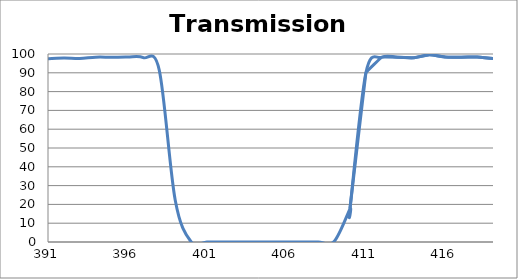
| Category | Transmission (%) |
|---|---|
| 2600.0 | 81.505 |
| 2599.0 | 81.325 |
| 2598.0 | 81.17 |
| 2597.0 | 81.029 |
| 2596.0 | 80.885 |
| 2595.0 | 80.709 |
| 2594.0 | 80.532 |
| 2593.0 | 80.373 |
| 2592.0 | 80.257 |
| 2591.0 | 80.102 |
| 2590.0 | 80.004 |
| 2589.0 | 79.88 |
| 2588.0 | 79.753 |
| 2587.0 | 79.691 |
| 2586.0 | 79.643 |
| 2585.0 | 79.518 |
| 2584.0 | 79.455 |
| 2583.0 | 79.403 |
| 2582.0 | 79.368 |
| 2581.0 | 79.414 |
| 2580.0 | 79.416 |
| 2579.0 | 79.408 |
| 2578.0 | 79.425 |
| 2577.0 | 79.477 |
| 2576.0 | 79.51 |
| 2575.0 | 79.573 |
| 2574.0 | 79.657 |
| 2573.0 | 79.706 |
| 2572.0 | 79.767 |
| 2571.0 | 79.872 |
| 2570.0 | 79.978 |
| 2569.0 | 80.113 |
| 2568.0 | 80.265 |
| 2567.0 | 80.411 |
| 2566.0 | 80.523 |
| 2565.0 | 80.657 |
| 2564.0 | 80.805 |
| 2563.0 | 80.95 |
| 2562.0 | 81.07 |
| 2561.0 | 81.199 |
| 2560.0 | 81.279 |
| 2559.0 | 81.383 |
| 2558.0 | 81.515 |
| 2557.0 | 81.59 |
| 2556.0 | 81.71 |
| 2555.0 | 81.803 |
| 2554.0 | 81.86 |
| 2553.0 | 81.938 |
| 2552.0 | 82.026 |
| 2551.0 | 82.08 |
| 2550.0 | 82.109 |
| 2549.0 | 82.13 |
| 2548.0 | 82.127 |
| 2547.0 | 82.061 |
| 2546.0 | 82.042 |
| 2545.0 | 82.046 |
| 2544.0 | 81.984 |
| 2543.0 | 81.902 |
| 2542.0 | 81.758 |
| 2541.0 | 81.629 |
| 2540.0 | 81.528 |
| 2539.0 | 81.471 |
| 2538.0 | 81.338 |
| 2537.0 | 81.219 |
| 2536.0 | 81.086 |
| 2535.0 | 80.915 |
| 2534.0 | 80.765 |
| 2533.0 | 80.627 |
| 2532.0 | 80.444 |
| 2531.0 | 80.249 |
| 2530.0 | 80.106 |
| 2529.0 | 79.963 |
| 2528.0 | 79.822 |
| 2527.0 | 79.716 |
| 2526.0 | 79.588 |
| 2525.0 | 79.464 |
| 2524.0 | 79.321 |
| 2523.0 | 79.19 |
| 2522.0 | 79.11 |
| 2521.0 | 79.058 |
| 2520.0 | 78.983 |
| 2519.0 | 78.946 |
| 2518.0 | 78.883 |
| 2517.0 | 78.867 |
| 2516.0 | 78.882 |
| 2515.0 | 78.927 |
| 2514.0 | 78.976 |
| 2513.0 | 79.034 |
| 2512.0 | 79.098 |
| 2511.0 | 79.187 |
| 2510.0 | 79.292 |
| 2509.0 | 79.455 |
| 2508.0 | 79.605 |
| 2507.0 | 79.755 |
| 2506.0 | 79.957 |
| 2505.0 | 80.179 |
| 2504.0 | 80.404 |
| 2503.0 | 80.652 |
| 2502.0 | 80.933 |
| 2501.0 | 81.179 |
| 2500.0 | 81.432 |
| 2499.0 | 81.675 |
| 2498.0 | 81.961 |
| 2497.0 | 82.24 |
| 2496.0 | 82.509 |
| 2495.0 | 82.776 |
| 2494.0 | 83.036 |
| 2493.0 | 83.261 |
| 2492.0 | 83.491 |
| 2491.0 | 83.715 |
| 2490.0 | 83.932 |
| 2489.0 | 84.124 |
| 2488.0 | 84.285 |
| 2487.0 | 84.411 |
| 2486.0 | 84.506 |
| 2485.0 | 84.6 |
| 2484.0 | 84.663 |
| 2483.0 | 84.667 |
| 2482.0 | 84.665 |
| 2481.0 | 84.608 |
| 2480.0 | 84.511 |
| 2479.0 | 84.399 |
| 2478.0 | 84.261 |
| 2477.0 | 84.068 |
| 2476.0 | 83.877 |
| 2475.0 | 83.631 |
| 2474.0 | 83.328 |
| 2473.0 | 83.002 |
| 2472.0 | 82.655 |
| 2471.0 | 82.271 |
| 2470.0 | 81.857 |
| 2469.0 | 81.446 |
| 2468.0 | 81.026 |
| 2467.0 | 80.596 |
| 2466.0 | 80.125 |
| 2465.0 | 79.645 |
| 2464.0 | 79.175 |
| 2463.0 | 78.736 |
| 2462.0 | 78.271 |
| 2461.0 | 77.819 |
| 2460.0 | 77.394 |
| 2459.0 | 76.996 |
| 2458.0 | 76.594 |
| 2457.0 | 76.221 |
| 2456.0 | 75.868 |
| 2455.0 | 75.517 |
| 2454.0 | 75.199 |
| 2453.0 | 74.909 |
| 2452.0 | 74.654 |
| 2451.0 | 74.422 |
| 2450.0 | 74.24 |
| 2449.0 | 74.1 |
| 2448.0 | 73.976 |
| 2447.0 | 73.879 |
| 2446.0 | 73.823 |
| 2445.0 | 73.828 |
| 2444.0 | 73.857 |
| 2443.0 | 73.939 |
| 2442.0 | 74.049 |
| 2441.0 | 74.206 |
| 2440.0 | 74.399 |
| 2439.0 | 74.628 |
| 2438.0 | 74.918 |
| 2437.0 | 75.265 |
| 2436.0 | 75.65 |
| 2435.0 | 76.057 |
| 2434.0 | 76.501 |
| 2433.0 | 76.994 |
| 2432.0 | 77.513 |
| 2431.0 | 78.064 |
| 2430.0 | 78.665 |
| 2429.0 | 79.292 |
| 2428.0 | 79.911 |
| 2427.0 | 80.556 |
| 2426.0 | 81.233 |
| 2425.0 | 81.949 |
| 2424.0 | 82.669 |
| 2423.0 | 83.368 |
| 2422.0 | 84.075 |
| 2421.0 | 84.778 |
| 2420.0 | 85.47 |
| 2419.0 | 86.127 |
| 2418.0 | 86.767 |
| 2417.0 | 87.406 |
| 2416.0 | 87.996 |
| 2415.0 | 88.53 |
| 2414.0 | 89.01 |
| 2413.0 | 89.428 |
| 2412.0 | 89.811 |
| 2411.0 | 90.143 |
| 2410.0 | 90.417 |
| 2409.0 | 90.65 |
| 2408.0 | 90.827 |
| 2407.0 | 90.922 |
| 2406.0 | 90.951 |
| 2405.0 | 90.899 |
| 2404.0 | 90.793 |
| 2403.0 | 90.626 |
| 2402.0 | 90.402 |
| 2401.0 | 90.124 |
| 2400.0 | 89.799 |
| 2399.0 | 89.415 |
| 2398.0 | 88.984 |
| 2397.0 | 88.524 |
| 2396.0 | 88.029 |
| 2395.0 | 87.504 |
| 2394.0 | 86.965 |
| 2393.0 | 86.405 |
| 2392.0 | 85.833 |
| 2391.0 | 85.267 |
| 2390.0 | 84.705 |
| 2389.0 | 84.138 |
| 2388.0 | 83.595 |
| 2387.0 | 83.078 |
| 2386.0 | 82.586 |
| 2385.0 | 82.103 |
| 2384.0 | 81.663 |
| 2383.0 | 81.265 |
| 2382.0 | 80.892 |
| 2381.0 | 80.572 |
| 2380.0 | 80.294 |
| 2379.0 | 80.064 |
| 2378.0 | 79.902 |
| 2377.0 | 79.772 |
| 2376.0 | 79.693 |
| 2375.0 | 79.665 |
| 2374.0 | 79.679 |
| 2373.0 | 79.739 |
| 2372.0 | 79.866 |
| 2371.0 | 80.029 |
| 2370.0 | 80.21 |
| 2369.0 | 80.454 |
| 2368.0 | 80.756 |
| 2367.0 | 81.091 |
| 2366.0 | 81.476 |
| 2365.0 | 81.931 |
| 2364.0 | 82.432 |
| 2363.0 | 82.922 |
| 2362.0 | 83.446 |
| 2361.0 | 84.02 |
| 2360.0 | 84.632 |
| 2359.0 | 85.286 |
| 2358.0 | 85.937 |
| 2357.0 | 86.585 |
| 2356.0 | 87.237 |
| 2355.0 | 87.923 |
| 2354.0 | 88.568 |
| 2353.0 | 89.222 |
| 2352.0 | 89.856 |
| 2351.0 | 90.472 |
| 2350.0 | 91.02 |
| 2349.0 | 91.53 |
| 2348.0 | 91.994 |
| 2347.0 | 92.431 |
| 2346.0 | 92.778 |
| 2345.0 | 93.046 |
| 2344.0 | 93.255 |
| 2343.0 | 93.433 |
| 2342.0 | 93.522 |
| 2341.0 | 93.52 |
| 2340.0 | 93.434 |
| 2339.0 | 93.32 |
| 2338.0 | 93.139 |
| 2337.0 | 92.886 |
| 2336.0 | 92.553 |
| 2335.0 | 92.158 |
| 2334.0 | 91.75 |
| 2333.0 | 91.283 |
| 2332.0 | 90.784 |
| 2331.0 | 90.245 |
| 2330.0 | 89.708 |
| 2329.0 | 89.118 |
| 2328.0 | 88.506 |
| 2327.0 | 87.868 |
| 2326.0 | 87.291 |
| 2325.0 | 86.664 |
| 2324.0 | 86.088 |
| 2323.0 | 85.506 |
| 2322.0 | 84.932 |
| 2321.0 | 84.404 |
| 2320.0 | 83.891 |
| 2319.0 | 83.404 |
| 2318.0 | 82.998 |
| 2317.0 | 82.629 |
| 2316.0 | 82.276 |
| 2315.0 | 81.95 |
| 2314.0 | 81.702 |
| 2313.0 | 81.476 |
| 2312.0 | 81.338 |
| 2311.0 | 81.286 |
| 2310.0 | 81.269 |
| 2309.0 | 81.293 |
| 2308.0 | 81.341 |
| 2307.0 | 81.485 |
| 2306.0 | 81.677 |
| 2305.0 | 81.931 |
| 2304.0 | 82.213 |
| 2303.0 | 82.566 |
| 2302.0 | 82.92 |
| 2301.0 | 83.36 |
| 2300.0 | 83.825 |
| 2299.0 | 84.349 |
| 2298.0 | 84.864 |
| 2297.0 | 85.427 |
| 2296.0 | 86.002 |
| 2295.0 | 86.581 |
| 2294.0 | 87.191 |
| 2293.0 | 87.789 |
| 2292.0 | 88.376 |
| 2291.0 | 88.966 |
| 2290.0 | 89.537 |
| 2289.0 | 90.091 |
| 2288.0 | 90.642 |
| 2287.0 | 91.156 |
| 2286.0 | 91.634 |
| 2285.0 | 92.08 |
| 2284.0 | 92.471 |
| 2283.0 | 92.81 |
| 2282.0 | 93.115 |
| 2281.0 | 93.344 |
| 2280.0 | 93.5 |
| 2279.0 | 93.62 |
| 2278.0 | 93.677 |
| 2277.0 | 93.631 |
| 2276.0 | 93.508 |
| 2275.0 | 93.35 |
| 2274.0 | 93.147 |
| 2273.0 | 92.903 |
| 2272.0 | 92.579 |
| 2271.0 | 92.209 |
| 2270.0 | 91.84 |
| 2269.0 | 91.4 |
| 2268.0 | 90.937 |
| 2267.0 | 90.468 |
| 2266.0 | 90.032 |
| 2265.0 | 89.496 |
| 2264.0 | 89.024 |
| 2263.0 | 88.556 |
| 2262.0 | 88.095 |
| 2261.0 | 87.675 |
| 2260.0 | 87.276 |
| 2259.0 | 86.876 |
| 2258.0 | 86.531 |
| 2257.0 | 86.218 |
| 2256.0 | 85.915 |
| 2255.0 | 85.703 |
| 2254.0 | 85.489 |
| 2253.0 | 85.335 |
| 2252.0 | 85.246 |
| 2251.0 | 85.195 |
| 2250.0 | 85.169 |
| 2249.0 | 85.183 |
| 2248.0 | 85.266 |
| 2247.0 | 85.405 |
| 2246.0 | 85.595 |
| 2245.0 | 85.775 |
| 2244.0 | 85.998 |
| 2243.0 | 86.243 |
| 2242.0 | 86.615 |
| 2241.0 | 86.948 |
| 2240.0 | 87.346 |
| 2239.0 | 87.733 |
| 2238.0 | 88.147 |
| 2237.0 | 88.592 |
| 2236.0 | 89.016 |
| 2235.0 | 89.464 |
| 2234.0 | 89.933 |
| 2233.0 | 90.358 |
| 2232.0 | 90.762 |
| 2231.0 | 91.135 |
| 2230.0 | 91.485 |
| 2229.0 | 91.822 |
| 2228.0 | 92.101 |
| 2227.0 | 92.36 |
| 2226.0 | 92.547 |
| 2225.0 | 92.667 |
| 2224.0 | 92.784 |
| 2223.0 | 92.824 |
| 2222.0 | 92.825 |
| 2221.0 | 92.78 |
| 2220.0 | 92.629 |
| 2219.0 | 92.437 |
| 2218.0 | 92.26 |
| 2217.0 | 91.982 |
| 2216.0 | 91.714 |
| 2215.0 | 91.404 |
| 2214.0 | 91.047 |
| 2213.0 | 90.668 |
| 2212.0 | 90.323 |
| 2211.0 | 89.85 |
| 2210.0 | 89.45 |
| 2209.0 | 89.045 |
| 2208.0 | 88.653 |
| 2207.0 | 88.267 |
| 2206.0 | 87.926 |
| 2205.0 | 87.549 |
| 2204.0 | 87.228 |
| 2203.0 | 86.936 |
| 2202.0 | 86.673 |
| 2201.0 | 86.442 |
| 2200.0 | 86.254 |
| 2199.0 | 86.066 |
| 2198.0 | 85.96 |
| 2197.0 | 85.886 |
| 2196.0 | 85.871 |
| 2195.0 | 85.873 |
| 2194.0 | 85.923 |
| 2193.0 | 86.076 |
| 2192.0 | 86.207 |
| 2191.0 | 86.397 |
| 2190.0 | 86.634 |
| 2189.0 | 86.908 |
| 2188.0 | 87.21 |
| 2187.0 | 87.525 |
| 2186.0 | 87.913 |
| 2185.0 | 88.317 |
| 2184.0 | 88.72 |
| 2183.0 | 89.176 |
| 2182.0 | 89.619 |
| 2181.0 | 90.054 |
| 2180.0 | 90.512 |
| 2179.0 | 90.931 |
| 2178.0 | 91.335 |
| 2177.0 | 91.761 |
| 2176.0 | 92.131 |
| 2175.0 | 92.507 |
| 2174.0 | 92.831 |
| 2173.0 | 93.097 |
| 2172.0 | 93.356 |
| 2171.0 | 93.554 |
| 2170.0 | 93.707 |
| 2169.0 | 93.842 |
| 2168.0 | 93.918 |
| 2167.0 | 93.982 |
| 2166.0 | 93.955 |
| 2165.0 | 93.922 |
| 2164.0 | 93.813 |
| 2163.0 | 93.669 |
| 2162.0 | 93.48 |
| 2161.0 | 93.247 |
| 2160.0 | 93.051 |
| 2159.0 | 92.78 |
| 2158.0 | 92.527 |
| 2157.0 | 92.229 |
| 2156.0 | 91.919 |
| 2155.0 | 91.62 |
| 2154.0 | 91.31 |
| 2153.0 | 91.038 |
| 2152.0 | 90.786 |
| 2151.0 | 90.55 |
| 2150.0 | 90.323 |
| 2149.0 | 90.13 |
| 2148.0 | 89.964 |
| 2147.0 | 89.812 |
| 2146.0 | 89.735 |
| 2145.0 | 89.673 |
| 2144.0 | 89.657 |
| 2143.0 | 89.671 |
| 2142.0 | 89.72 |
| 2141.0 | 89.806 |
| 2140.0 | 89.933 |
| 2139.0 | 90.066 |
| 2138.0 | 90.257 |
| 2137.0 | 90.47 |
| 2136.0 | 90.693 |
| 2135.0 | 90.958 |
| 2134.0 | 91.221 |
| 2133.0 | 91.495 |
| 2132.0 | 91.777 |
| 2131.0 | 92.078 |
| 2130.0 | 92.375 |
| 2129.0 | 92.673 |
| 2128.0 | 92.894 |
| 2127.0 | 93.145 |
| 2126.0 | 93.387 |
| 2125.0 | 93.62 |
| 2124.0 | 93.807 |
| 2123.0 | 93.931 |
| 2122.0 | 94.027 |
| 2121.0 | 94.088 |
| 2120.0 | 94.12 |
| 2119.0 | 94.115 |
| 2118.0 | 94.046 |
| 2117.0 | 93.924 |
| 2116.0 | 93.768 |
| 2115.0 | 93.599 |
| 2114.0 | 93.392 |
| 2113.0 | 93.168 |
| 2112.0 | 92.896 |
| 2111.0 | 92.582 |
| 2110.0 | 92.283 |
| 2109.0 | 91.966 |
| 2108.0 | 91.624 |
| 2107.0 | 91.301 |
| 2106.0 | 91.007 |
| 2105.0 | 90.713 |
| 2104.0 | 90.436 |
| 2103.0 | 90.165 |
| 2102.0 | 89.909 |
| 2101.0 | 89.713 |
| 2100.0 | 89.541 |
| 2099.0 | 89.406 |
| 2098.0 | 89.297 |
| 2097.0 | 89.21 |
| 2096.0 | 89.199 |
| 2095.0 | 89.224 |
| 2094.0 | 89.289 |
| 2093.0 | 89.397 |
| 2092.0 | 89.531 |
| 2091.0 | 89.672 |
| 2090.0 | 89.82 |
| 2089.0 | 89.996 |
| 2088.0 | 90.218 |
| 2087.0 | 90.509 |
| 2086.0 | 90.782 |
| 2085.0 | 91.065 |
| 2084.0 | 91.31 |
| 2083.0 | 91.564 |
| 2082.0 | 91.793 |
| 2081.0 | 92.022 |
| 2080.0 | 92.269 |
| 2079.0 | 92.462 |
| 2078.0 | 92.597 |
| 2077.0 | 92.691 |
| 2076.0 | 92.731 |
| 2075.0 | 92.71 |
| 2074.0 | 92.637 |
| 2073.0 | 92.522 |
| 2072.0 | 92.366 |
| 2071.0 | 92.118 |
| 2070.0 | 91.825 |
| 2069.0 | 91.478 |
| 2068.0 | 91.078 |
| 2067.0 | 90.654 |
| 2066.0 | 90.193 |
| 2065.0 | 89.69 |
| 2064.0 | 89.182 |
| 2063.0 | 88.652 |
| 2062.0 | 88.115 |
| 2061.0 | 87.611 |
| 2060.0 | 87.128 |
| 2059.0 | 86.646 |
| 2058.0 | 86.181 |
| 2057.0 | 85.746 |
| 2056.0 | 85.338 |
| 2055.0 | 84.996 |
| 2054.0 | 84.741 |
| 2053.0 | 84.511 |
| 2052.0 | 84.299 |
| 2051.0 | 84.145 |
| 2050.0 | 84.072 |
| 2049.0 | 84.042 |
| 2048.0 | 84.071 |
| 2047.0 | 84.171 |
| 2046.0 | 84.346 |
| 2045.0 | 84.565 |
| 2044.0 | 84.823 |
| 2043.0 | 85.153 |
| 2042.0 | 85.554 |
| 2041.0 | 86.015 |
| 2040.0 | 86.502 |
| 2039.0 | 86.973 |
| 2038.0 | 87.482 |
| 2037.0 | 88.023 |
| 2036.0 | 88.598 |
| 2035.0 | 89.177 |
| 2034.0 | 89.708 |
| 2033.0 | 90.196 |
| 2032.0 | 90.659 |
| 2031.0 | 91.089 |
| 2030.0 | 91.445 |
| 2029.0 | 91.746 |
| 2028.0 | 91.975 |
| 2027.0 | 92.117 |
| 2026.0 | 92.162 |
| 2025.0 | 92.107 |
| 2024.0 | 91.984 |
| 2023.0 | 91.776 |
| 2022.0 | 91.469 |
| 2021.0 | 91.082 |
| 2020.0 | 90.583 |
| 2019.0 | 90.011 |
| 2018.0 | 89.407 |
| 2017.0 | 88.752 |
| 2016.0 | 88.108 |
| 2015.0 | 87.445 |
| 2014.0 | 86.761 |
| 2013.0 | 86.085 |
| 2012.0 | 85.383 |
| 2011.0 | 84.731 |
| 2010.0 | 84.12 |
| 2009.0 | 83.534 |
| 2008.0 | 82.977 |
| 2007.0 | 82.463 |
| 2006.0 | 82.01 |
| 2005.0 | 81.628 |
| 2004.0 | 81.321 |
| 2003.0 | 81.071 |
| 2002.0 | 80.902 |
| 2001.0 | 80.811 |
| 2000.0 | 80.783 |
| 1999.0 | 80.832 |
| 1998.0 | 80.968 |
| 1997.0 | 81.2 |
| 1996.0 | 81.491 |
| 1995.0 | 81.842 |
| 1994.0 | 82.261 |
| 1993.0 | 82.78 |
| 1992.0 | 83.34 |
| 1991.0 | 83.91 |
| 1990.0 | 84.527 |
| 1989.0 | 85.172 |
| 1988.0 | 85.806 |
| 1987.0 | 86.436 |
| 1986.0 | 87.053 |
| 1985.0 | 87.657 |
| 1984.0 | 88.236 |
| 1983.0 | 88.751 |
| 1982.0 | 89.198 |
| 1981.0 | 89.582 |
| 1980.0 | 89.881 |
| 1979.0 | 90.078 |
| 1978.0 | 90.212 |
| 1977.0 | 90.269 |
| 1976.0 | 90.254 |
| 1975.0 | 90.134 |
| 1974.0 | 89.926 |
| 1973.0 | 89.647 |
| 1972.0 | 89.301 |
| 1971.0 | 88.906 |
| 1970.0 | 88.434 |
| 1969.0 | 87.938 |
| 1968.0 | 87.451 |
| 1967.0 | 86.967 |
| 1966.0 | 86.441 |
| 1965.0 | 85.919 |
| 1964.0 | 85.417 |
| 1963.0 | 84.992 |
| 1962.0 | 84.55 |
| 1961.0 | 84.181 |
| 1960.0 | 83.904 |
| 1959.0 | 83.68 |
| 1958.0 | 83.479 |
| 1957.0 | 83.374 |
| 1956.0 | 83.357 |
| 1955.0 | 83.404 |
| 1954.0 | 83.526 |
| 1953.0 | 83.758 |
| 1952.0 | 84.025 |
| 1951.0 | 84.372 |
| 1950.0 | 84.778 |
| 1949.0 | 85.29 |
| 1948.0 | 85.779 |
| 1947.0 | 86.368 |
| 1946.0 | 86.995 |
| 1945.0 | 87.593 |
| 1944.0 | 88.262 |
| 1943.0 | 88.885 |
| 1942.0 | 89.445 |
| 1941.0 | 90.051 |
| 1940.0 | 90.615 |
| 1939.0 | 91.135 |
| 1938.0 | 91.515 |
| 1937.0 | 91.824 |
| 1936.0 | 92.082 |
| 1935.0 | 92.285 |
| 1934.0 | 92.384 |
| 1933.0 | 92.388 |
| 1932.0 | 92.29 |
| 1931.0 | 92.096 |
| 1930.0 | 91.86 |
| 1929.0 | 91.542 |
| 1928.0 | 91.113 |
| 1927.0 | 90.635 |
| 1926.0 | 90.115 |
| 1925.0 | 89.559 |
| 1924.0 | 89.024 |
| 1923.0 | 88.507 |
| 1922.0 | 87.985 |
| 1921.0 | 87.402 |
| 1920.0 | 86.801 |
| 1919.0 | 86.281 |
| 1918.0 | 85.857 |
| 1917.0 | 85.467 |
| 1916.0 | 85.239 |
| 1915.0 | 85.085 |
| 1914.0 | 84.956 |
| 1913.0 | 84.851 |
| 1912.0 | 84.801 |
| 1911.0 | 84.857 |
| 1910.0 | 84.981 |
| 1909.0 | 85.197 |
| 1908.0 | 85.51 |
| 1907.0 | 85.846 |
| 1906.0 | 86.362 |
| 1905.0 | 86.854 |
| 1904.0 | 87.409 |
| 1903.0 | 87.961 |
| 1902.0 | 88.543 |
| 1901.0 | 89.161 |
| 1900.0 | 89.839 |
| 1899.0 | 90.473 |
| 1898.0 | 91.148 |
| 1897.0 | 91.701 |
| 1896.0 | 92.193 |
| 1895.0 | 92.663 |
| 1894.0 | 93.124 |
| 1893.0 | 93.532 |
| 1892.0 | 93.876 |
| 1891.0 | 94.156 |
| 1890.0 | 94.328 |
| 1889.0 | 94.433 |
| 1888.0 | 94.519 |
| 1887.0 | 94.535 |
| 1886.0 | 94.472 |
| 1885.0 | 94.388 |
| 1884.0 | 94.213 |
| 1883.0 | 93.964 |
| 1882.0 | 93.768 |
| 1881.0 | 93.538 |
| 1880.0 | 93.245 |
| 1879.0 | 93.034 |
| 1878.0 | 92.809 |
| 1877.0 | 92.557 |
| 1876.0 | 92.334 |
| 1875.0 | 92.173 |
| 1874.0 | 91.978 |
| 1873.0 | 91.878 |
| 1872.0 | 91.741 |
| 1871.0 | 91.657 |
| 1870.0 | 91.628 |
| 1869.0 | 91.721 |
| 1868.0 | 91.719 |
| 1867.0 | 91.835 |
| 1866.0 | 91.926 |
| 1865.0 | 92.06 |
| 1864.0 | 92.22 |
| 1863.0 | 92.407 |
| 1862.0 | 92.635 |
| 1861.0 | 92.782 |
| 1860.0 | 92.924 |
| 1859.0 | 93.09 |
| 1858.0 | 93.209 |
| 1857.0 | 93.351 |
| 1856.0 | 93.439 |
| 1855.0 | 93.469 |
| 1854.0 | 93.54 |
| 1853.0 | 93.569 |
| 1852.0 | 93.596 |
| 1851.0 | 93.592 |
| 1850.0 | 93.614 |
| 1849.0 | 93.581 |
| 1848.0 | 93.616 |
| 1847.0 | 93.51 |
| 1846.0 | 93.425 |
| 1845.0 | 93.42 |
| 1844.0 | 93.274 |
| 1843.0 | 93.289 |
| 1842.0 | 93.339 |
| 1841.0 | 93.259 |
| 1840.0 | 93.305 |
| 1839.0 | 93.35 |
| 1838.0 | 93.29 |
| 1837.0 | 93.367 |
| 1836.0 | 93.456 |
| 1835.0 | 93.534 |
| 1834.0 | 93.605 |
| 1833.0 | 93.662 |
| 1832.0 | 93.757 |
| 1831.0 | 93.806 |
| 1830.0 | 93.851 |
| 1829.0 | 93.818 |
| 1828.0 | 93.796 |
| 1827.0 | 93.708 |
| 1826.0 | 93.586 |
| 1825.0 | 93.35 |
| 1824.0 | 93.041 |
| 1823.0 | 92.855 |
| 1822.0 | 92.636 |
| 1821.0 | 92.256 |
| 1820.0 | 91.802 |
| 1819.0 | 91.208 |
| 1818.0 | 90.741 |
| 1817.0 | 90.236 |
| 1816.0 | 89.799 |
| 1815.0 | 89.3 |
| 1814.0 | 88.769 |
| 1813.0 | 88.298 |
| 1812.0 | 87.837 |
| 1811.0 | 87.437 |
| 1810.0 | 87.051 |
| 1809.0 | 86.741 |
| 1808.0 | 86.522 |
| 1807.0 | 86.348 |
| 1806.0 | 86.2 |
| 1805.0 | 86.202 |
| 1804.0 | 86.275 |
| 1803.0 | 86.407 |
| 1802.0 | 86.598 |
| 1801.0 | 86.866 |
| 1800.0 | 87.245 |
| 1799.0 | 87.662 |
| 1798.0 | 88.139 |
| 1797.0 | 88.63 |
| 1796.0 | 89.092 |
| 1795.0 | 89.577 |
| 1794.0 | 90.019 |
| 1793.0 | 90.448 |
| 1792.0 | 90.791 |
| 1791.0 | 91.057 |
| 1790.0 | 91.209 |
| 1789.0 | 91.268 |
| 1788.0 | 91.171 |
| 1787.0 | 90.912 |
| 1786.0 | 90.515 |
| 1785.0 | 89.964 |
| 1784.0 | 89.316 |
| 1783.0 | 88.544 |
| 1782.0 | 87.661 |
| 1781.0 | 86.766 |
| 1780.0 | 85.75 |
| 1779.0 | 84.66 |
| 1778.0 | 83.572 |
| 1777.0 | 82.538 |
| 1776.0 | 81.513 |
| 1775.0 | 80.606 |
| 1774.0 | 79.73 |
| 1773.0 | 78.948 |
| 1772.0 | 78.243 |
| 1771.0 | 77.657 |
| 1770.0 | 77.147 |
| 1769.0 | 76.775 |
| 1768.0 | 76.53 |
| 1767.0 | 76.388 |
| 1766.0 | 76.367 |
| 1765.0 | 76.512 |
| 1764.0 | 76.772 |
| 1763.0 | 77.142 |
| 1762.0 | 77.62 |
| 1761.0 | 78.216 |
| 1760.0 | 78.901 |
| 1759.0 | 79.647 |
| 1758.0 | 80.469 |
| 1757.0 | 81.303 |
| 1756.0 | 82.153 |
| 1755.0 | 82.988 |
| 1754.0 | 83.75 |
| 1753.0 | 84.467 |
| 1752.0 | 85.085 |
| 1751.0 | 85.523 |
| 1750.0 | 85.843 |
| 1749.0 | 86.014 |
| 1748.0 | 86.022 |
| 1747.0 | 85.879 |
| 1746.0 | 85.583 |
| 1745.0 | 85.155 |
| 1744.0 | 84.572 |
| 1743.0 | 83.941 |
| 1742.0 | 83.217 |
| 1741.0 | 82.468 |
| 1740.0 | 81.699 |
| 1739.0 | 80.974 |
| 1738.0 | 80.239 |
| 1737.0 | 79.58 |
| 1736.0 | 79.008 |
| 1735.0 | 78.523 |
| 1734.0 | 78.098 |
| 1733.0 | 77.807 |
| 1732.0 | 77.601 |
| 1731.0 | 77.486 |
| 1730.0 | 77.528 |
| 1729.0 | 77.669 |
| 1728.0 | 77.929 |
| 1727.0 | 78.273 |
| 1726.0 | 78.693 |
| 1725.0 | 79.165 |
| 1724.0 | 79.71 |
| 1723.0 | 80.335 |
| 1722.0 | 80.958 |
| 1721.0 | 81.585 |
| 1720.0 | 82.178 |
| 1719.0 | 82.659 |
| 1718.0 | 83.07 |
| 1717.0 | 83.414 |
| 1716.0 | 83.63 |
| 1715.0 | 83.724 |
| 1714.0 | 83.682 |
| 1713.0 | 83.459 |
| 1712.0 | 83.115 |
| 1711.0 | 82.67 |
| 1710.0 | 82.12 |
| 1709.0 | 81.507 |
| 1708.0 | 80.845 |
| 1707.0 | 80.175 |
| 1706.0 | 79.494 |
| 1705.0 | 78.818 |
| 1704.0 | 78.181 |
| 1703.0 | 77.62 |
| 1702.0 | 77.126 |
| 1701.0 | 76.755 |
| 1700.0 | 76.463 |
| 1699.0 | 76.265 |
| 1698.0 | 76.158 |
| 1697.0 | 76.163 |
| 1696.0 | 76.258 |
| 1695.0 | 76.472 |
| 1694.0 | 76.742 |
| 1693.0 | 77.035 |
| 1692.0 | 77.385 |
| 1691.0 | 77.746 |
| 1690.0 | 78.118 |
| 1689.0 | 78.471 |
| 1688.0 | 78.798 |
| 1687.0 | 79.058 |
| 1686.0 | 79.214 |
| 1685.0 | 79.257 |
| 1684.0 | 79.212 |
| 1683.0 | 79.056 |
| 1682.0 | 78.768 |
| 1681.0 | 78.354 |
| 1680.0 | 77.829 |
| 1679.0 | 77.202 |
| 1678.0 | 76.515 |
| 1677.0 | 75.799 |
| 1676.0 | 75.061 |
| 1675.0 | 74.33 |
| 1674.0 | 73.626 |
| 1673.0 | 73.009 |
| 1672.0 | 72.484 |
| 1671.0 | 72.026 |
| 1670.0 | 71.68 |
| 1669.0 | 71.453 |
| 1668.0 | 71.355 |
| 1667.0 | 71.393 |
| 1666.0 | 71.542 |
| 1665.0 | 71.818 |
| 1664.0 | 72.216 |
| 1663.0 | 72.696 |
| 1662.0 | 73.242 |
| 1661.0 | 73.841 |
| 1660.0 | 74.427 |
| 1659.0 | 74.999 |
| 1658.0 | 75.543 |
| 1657.0 | 75.973 |
| 1656.0 | 76.305 |
| 1655.0 | 76.519 |
| 1654.0 | 76.555 |
| 1653.0 | 76.414 |
| 1652.0 | 76.089 |
| 1651.0 | 75.575 |
| 1650.0 | 74.906 |
| 1649.0 | 74.108 |
| 1648.0 | 73.207 |
| 1647.0 | 72.169 |
| 1646.0 | 71.081 |
| 1645.0 | 70.002 |
| 1644.0 | 68.895 |
| 1643.0 | 67.853 |
| 1642.0 | 66.872 |
| 1641.0 | 65.984 |
| 1640.0 | 65.218 |
| 1639.0 | 64.597 |
| 1638.0 | 64.148 |
| 1637.0 | 63.861 |
| 1636.0 | 63.756 |
| 1635.0 | 63.816 |
| 1634.0 | 64.034 |
| 1633.0 | 64.441 |
| 1632.0 | 64.968 |
| 1631.0 | 65.612 |
| 1630.0 | 66.378 |
| 1629.0 | 67.207 |
| 1628.0 | 68.089 |
| 1627.0 | 68.99 |
| 1626.0 | 69.854 |
| 1625.0 | 70.661 |
| 1624.0 | 71.367 |
| 1623.0 | 71.919 |
| 1622.0 | 72.294 |
| 1621.0 | 72.486 |
| 1620.0 | 72.508 |
| 1619.0 | 72.334 |
| 1618.0 | 71.994 |
| 1617.0 | 71.524 |
| 1616.0 | 70.955 |
| 1615.0 | 70.325 |
| 1614.0 | 69.647 |
| 1613.0 | 68.967 |
| 1612.0 | 68.334 |
| 1611.0 | 67.769 |
| 1610.0 | 67.306 |
| 1609.0 | 66.964 |
| 1608.0 | 66.772 |
| 1607.0 | 66.742 |
| 1606.0 | 66.862 |
| 1605.0 | 67.152 |
| 1604.0 | 67.587 |
| 1603.0 | 68.183 |
| 1602.0 | 68.933 |
| 1601.0 | 69.785 |
| 1600.0 | 70.723 |
| 1599.0 | 71.707 |
| 1598.0 | 72.671 |
| 1597.0 | 73.563 |
| 1596.0 | 74.327 |
| 1595.0 | 74.878 |
| 1594.0 | 75.185 |
| 1593.0 | 75.231 |
| 1592.0 | 74.972 |
| 1591.0 | 74.433 |
| 1590.0 | 73.625 |
| 1589.0 | 72.576 |
| 1588.0 | 71.35 |
| 1587.0 | 69.993 |
| 1586.0 | 68.56 |
| 1585.0 | 67.162 |
| 1584.0 | 65.832 |
| 1583.0 | 64.62 |
| 1582.0 | 63.545 |
| 1581.0 | 62.614 |
| 1580.0 | 61.905 |
| 1579.0 | 61.414 |
| 1578.0 | 61.121 |
| 1577.0 | 61.05 |
| 1576.0 | 61.213 |
| 1575.0 | 61.603 |
| 1574.0 | 62.197 |
| 1573.0 | 63.019 |
| 1572.0 | 63.995 |
| 1571.0 | 65.102 |
| 1570.0 | 66.351 |
| 1569.0 | 67.66 |
| 1568.0 | 68.958 |
| 1567.0 | 70.217 |
| 1566.0 | 71.358 |
| 1565.0 | 72.392 |
| 1564.0 | 73.187 |
| 1563.0 | 73.661 |
| 1562.0 | 73.808 |
| 1561.0 | 73.623 |
| 1560.0 | 73.169 |
| 1559.0 | 72.419 |
| 1558.0 | 71.486 |
| 1557.0 | 70.355 |
| 1556.0 | 69.177 |
| 1555.0 | 68.003 |
| 1554.0 | 66.89 |
| 1553.0 | 65.866 |
| 1552.0 | 64.982 |
| 1551.0 | 64.341 |
| 1550.0 | 63.873 |
| 1549.0 | 63.606 |
| 1548.0 | 63.581 |
| 1547.0 | 63.767 |
| 1546.0 | 64.188 |
| 1545.0 | 64.789 |
| 1544.0 | 65.573 |
| 1543.0 | 66.473 |
| 1542.0 | 67.439 |
| 1541.0 | 68.498 |
| 1540.0 | 69.476 |
| 1539.0 | 70.365 |
| 1538.0 | 71.092 |
| 1537.0 | 71.646 |
| 1536.0 | 71.979 |
| 1535.0 | 72.06 |
| 1534.0 | 71.901 |
| 1533.0 | 71.503 |
| 1532.0 | 70.904 |
| 1531.0 | 70.188 |
| 1530.0 | 69.38 |
| 1529.0 | 68.461 |
| 1528.0 | 67.577 |
| 1527.0 | 66.72 |
| 1526.0 | 66.043 |
| 1525.0 | 65.479 |
| 1524.0 | 65.079 |
| 1523.0 | 64.886 |
| 1522.0 | 64.908 |
| 1521.0 | 65.158 |
| 1520.0 | 65.602 |
| 1519.0 | 66.299 |
| 1518.0 | 67.069 |
| 1517.0 | 67.984 |
| 1516.0 | 68.967 |
| 1515.0 | 69.905 |
| 1514.0 | 70.734 |
| 1513.0 | 71.392 |
| 1512.0 | 71.791 |
| 1511.0 | 71.832 |
| 1510.0 | 71.493 |
| 1509.0 | 70.767 |
| 1508.0 | 69.723 |
| 1507.0 | 68.341 |
| 1506.0 | 66.754 |
| 1505.0 | 65.118 |
| 1504.0 | 63.38 |
| 1503.0 | 61.655 |
| 1502.0 | 60.052 |
| 1501.0 | 58.54 |
| 1500.0 | 57.27 |
| 1499.0 | 56.243 |
| 1498.0 | 55.439 |
| 1497.0 | 54.848 |
| 1496.0 | 54.524 |
| 1495.0 | 54.46 |
| 1494.0 | 54.612 |
| 1493.0 | 54.968 |
| 1492.0 | 55.491 |
| 1491.0 | 56.231 |
| 1490.0 | 57.023 |
| 1489.0 | 57.903 |
| 1488.0 | 58.752 |
| 1487.0 | 59.625 |
| 1486.0 | 60.297 |
| 1485.0 | 60.814 |
| 1484.0 | 61.019 |
| 1483.0 | 60.944 |
| 1482.0 | 60.582 |
| 1481.0 | 59.947 |
| 1480.0 | 59.039 |
| 1479.0 | 57.973 |
| 1478.0 | 56.858 |
| 1477.0 | 55.703 |
| 1476.0 | 54.592 |
| 1475.0 | 53.51 |
| 1474.0 | 52.752 |
| 1473.0 | 52.129 |
| 1472.0 | 51.753 |
| 1471.0 | 51.619 |
| 1470.0 | 51.761 |
| 1469.0 | 52.202 |
| 1468.0 | 52.863 |
| 1467.0 | 53.869 |
| 1466.0 | 55.086 |
| 1465.0 | 56.548 |
| 1464.0 | 58.153 |
| 1463.0 | 59.863 |
| 1462.0 | 61.617 |
| 1461.0 | 63.328 |
| 1460.0 | 64.729 |
| 1459.0 | 65.919 |
| 1458.0 | 66.709 |
| 1457.0 | 67.027 |
| 1456.0 | 66.925 |
| 1455.0 | 66.36 |
| 1454.0 | 65.483 |
| 1453.0 | 64.218 |
| 1452.0 | 62.835 |
| 1451.0 | 61.286 |
| 1450.0 | 59.727 |
| 1449.0 | 58.209 |
| 1448.0 | 56.886 |
| 1447.0 | 55.675 |
| 1446.0 | 54.84 |
| 1445.0 | 54.189 |
| 1444.0 | 53.679 |
| 1443.0 | 53.504 |
| 1442.0 | 53.586 |
| 1441.0 | 53.966 |
| 1440.0 | 54.542 |
| 1439.0 | 55.43 |
| 1438.0 | 56.439 |
| 1437.0 | 57.619 |
| 1436.0 | 58.92 |
| 1435.0 | 60.29 |
| 1434.0 | 61.72 |
| 1433.0 | 63.141 |
| 1432.0 | 64.421 |
| 1431.0 | 65.646 |
| 1430.0 | 66.759 |
| 1429.0 | 67.714 |
| 1428.0 | 68.534 |
| 1427.0 | 69.26 |
| 1426.0 | 69.86 |
| 1425.0 | 70.402 |
| 1424.0 | 70.812 |
| 1423.0 | 71.19 |
| 1422.0 | 71.504 |
| 1421.0 | 71.758 |
| 1420.0 | 71.965 |
| 1419.0 | 72.108 |
| 1418.0 | 72.127 |
| 1417.0 | 72.03 |
| 1416.0 | 71.784 |
| 1415.0 | 71.423 |
| 1414.0 | 70.885 |
| 1413.0 | 70.045 |
| 1412.0 | 69.05 |
| 1411.0 | 67.996 |
| 1410.0 | 66.906 |
| 1409.0 | 65.717 |
| 1408.0 | 64.492 |
| 1407.0 | 63.214 |
| 1406.0 | 62.156 |
| 1405.0 | 61.242 |
| 1404.0 | 60.502 |
| 1403.0 | 59.933 |
| 1402.0 | 59.554 |
| 1401.0 | 59.604 |
| 1400.0 | 59.855 |
| 1399.0 | 60.241 |
| 1398.0 | 60.65 |
| 1397.0 | 61.36 |
| 1396.0 | 62.481 |
| 1395.0 | 63.592 |
| 1394.0 | 64.795 |
| 1393.0 | 65.773 |
| 1392.0 | 66.749 |
| 1391.0 | 67.746 |
| 1390.0 | 68.443 |
| 1389.0 | 68.956 |
| 1388.0 | 69.304 |
| 1387.0 | 69.278 |
| 1386.0 | 69.109 |
| 1385.0 | 68.786 |
| 1384.0 | 68.433 |
| 1383.0 | 68.059 |
| 1382.0 | 67.599 |
| 1381.0 | 67.062 |
| 1380.0 | 66.75 |
| 1379.0 | 66.592 |
| 1378.0 | 66.528 |
| 1377.0 | 66.551 |
| 1376.0 | 66.603 |
| 1375.0 | 66.705 |
| 1374.0 | 66.67 |
| 1373.0 | 66.614 |
| 1372.0 | 66.518 |
| 1371.0 | 66.355 |
| 1370.0 | 66.107 |
| 1369.0 | 65.653 |
| 1368.0 | 65.216 |
| 1367.0 | 64.698 |
| 1366.0 | 64.178 |
| 1365.0 | 63.765 |
| 1364.0 | 63.401 |
| 1363.0 | 63.101 |
| 1362.0 | 62.988 |
| 1361.0 | 63.042 |
| 1360.0 | 63.244 |
| 1359.0 | 63.544 |
| 1358.0 | 64.236 |
| 1357.0 | 65.028 |
| 1356.0 | 65.844 |
| 1355.0 | 66.78 |
| 1354.0 | 67.415 |
| 1353.0 | 67.873 |
| 1352.0 | 68.045 |
| 1351.0 | 67.951 |
| 1350.0 | 67.515 |
| 1349.0 | 66.738 |
| 1348.0 | 65.622 |
| 1347.0 | 64.278 |
| 1346.0 | 62.81 |
| 1345.0 | 61.297 |
| 1344.0 | 59.958 |
| 1343.0 | 58.873 |
| 1342.0 | 58.015 |
| 1341.0 | 57.398 |
| 1340.0 | 57.113 |
| 1339.0 | 57.178 |
| 1338.0 | 57.601 |
| 1337.0 | 58.33 |
| 1336.0 | 59.335 |
| 1335.0 | 60.573 |
| 1334.0 | 61.934 |
| 1333.0 | 63.333 |
| 1332.0 | 64.639 |
| 1331.0 | 65.724 |
| 1330.0 | 66.368 |
| 1329.0 | 66.559 |
| 1328.0 | 66.224 |
| 1327.0 | 65.379 |
| 1326.0 | 64.131 |
| 1325.0 | 62.536 |
| 1324.0 | 60.799 |
| 1323.0 | 59.036 |
| 1322.0 | 57.364 |
| 1321.0 | 55.934 |
| 1320.0 | 54.802 |
| 1319.0 | 54.024 |
| 1318.0 | 53.686 |
| 1317.0 | 53.734 |
| 1316.0 | 54.179 |
| 1315.0 | 55.009 |
| 1314.0 | 56.133 |
| 1313.0 | 57.501 |
| 1312.0 | 58.999 |
| 1311.0 | 60.596 |
| 1310.0 | 62.076 |
| 1309.0 | 63.343 |
| 1308.0 | 64.282 |
| 1307.0 | 64.812 |
| 1306.0 | 64.938 |
| 1305.0 | 64.708 |
| 1304.0 | 64.169 |
| 1303.0 | 63.454 |
| 1302.0 | 62.666 |
| 1301.0 | 61.948 |
| 1300.0 | 61.401 |
| 1299.0 | 61.043 |
| 1298.0 | 60.895 |
| 1297.0 | 60.979 |
| 1296.0 | 61.326 |
| 1295.0 | 61.851 |
| 1294.0 | 62.507 |
| 1293.0 | 63.236 |
| 1292.0 | 63.944 |
| 1291.0 | 64.531 |
| 1290.0 | 64.916 |
| 1289.0 | 65.073 |
| 1288.0 | 64.977 |
| 1287.0 | 64.628 |
| 1286.0 | 64.09 |
| 1285.0 | 63.42 |
| 1284.0 | 62.709 |
| 1283.0 | 62.041 |
| 1282.0 | 61.514 |
| 1281.0 | 61.213 |
| 1280.0 | 61.146 |
| 1279.0 | 61.321 |
| 1278.0 | 61.743 |
| 1277.0 | 62.343 |
| 1276.0 | 63.003 |
| 1275.0 | 63.633 |
| 1274.0 | 64.152 |
| 1273.0 | 64.42 |
| 1272.0 | 64.331 |
| 1271.0 | 63.861 |
| 1270.0 | 63.004 |
| 1269.0 | 61.849 |
| 1268.0 | 60.498 |
| 1267.0 | 59.1 |
| 1266.0 | 57.757 |
| 1265.0 | 56.57 |
| 1264.0 | 55.714 |
| 1263.0 | 55.205 |
| 1262.0 | 55.028 |
| 1261.0 | 55.233 |
| 1260.0 | 55.828 |
| 1259.0 | 56.711 |
| 1258.0 | 57.824 |
| 1257.0 | 59.099 |
| 1256.0 | 60.409 |
| 1255.0 | 61.625 |
| 1254.0 | 62.611 |
| 1253.0 | 63.183 |
| 1252.0 | 63.267 |
| 1251.0 | 62.885 |
| 1250.0 | 62.053 |
| 1249.0 | 60.887 |
| 1248.0 | 59.524 |
| 1247.0 | 58.146 |
| 1246.0 | 56.875 |
| 1245.0 | 55.796 |
| 1244.0 | 55.009 |
| 1243.0 | 54.579 |
| 1242.0 | 54.549 |
| 1241.0 | 54.894 |
| 1240.0 | 55.591 |
| 1239.0 | 56.552 |
| 1238.0 | 57.711 |
| 1237.0 | 58.991 |
| 1236.0 | 60.253 |
| 1235.0 | 61.356 |
| 1234.0 | 62.226 |
| 1233.0 | 62.782 |
| 1232.0 | 62.985 |
| 1231.0 | 62.876 |
| 1230.0 | 62.543 |
| 1229.0 | 62.078 |
| 1228.0 | 61.565 |
| 1227.0 | 61.114 |
| 1226.0 | 60.774 |
| 1225.0 | 60.567 |
| 1224.0 | 60.528 |
| 1223.0 | 60.64 |
| 1222.0 | 60.896 |
| 1221.0 | 61.213 |
| 1220.0 | 61.569 |
| 1219.0 | 61.9 |
| 1218.0 | 62.152 |
| 1217.0 | 62.315 |
| 1216.0 | 62.385 |
| 1215.0 | 62.381 |
| 1214.0 | 62.344 |
| 1213.0 | 62.307 |
| 1212.0 | 62.289 |
| 1211.0 | 62.312 |
| 1210.0 | 62.381 |
| 1209.0 | 62.51 |
| 1208.0 | 62.67 |
| 1207.0 | 62.797 |
| 1206.0 | 62.872 |
| 1205.0 | 62.845 |
| 1204.0 | 62.638 |
| 1203.0 | 62.203 |
| 1202.0 | 61.612 |
| 1201.0 | 60.896 |
| 1200.0 | 60.048 |
| 1199.0 | 59.094 |
| 1198.0 | 58.237 |
| 1197.0 | 57.539 |
| 1196.0 | 57.006 |
| 1195.0 | 56.705 |
| 1194.0 | 56.624 |
| 1193.0 | 56.744 |
| 1192.0 | 57.029 |
| 1191.0 | 57.448 |
| 1190.0 | 57.915 |
| 1189.0 | 58.363 |
| 1188.0 | 58.692 |
| 1187.0 | 58.865 |
| 1186.0 | 58.89 |
| 1185.0 | 58.758 |
| 1184.0 | 58.512 |
| 1183.0 | 58.183 |
| 1182.0 | 57.862 |
| 1181.0 | 57.61 |
| 1180.0 | 57.444 |
| 1179.0 | 57.389 |
| 1178.0 | 57.43 |
| 1177.0 | 57.526 |
| 1176.0 | 57.649 |
| 1175.0 | 57.746 |
| 1174.0 | 57.743 |
| 1173.0 | 57.593 |
| 1172.0 | 57.263 |
| 1171.0 | 56.752 |
| 1170.0 | 56.139 |
| 1169.0 | 55.481 |
| 1168.0 | 54.811 |
| 1167.0 | 54.284 |
| 1166.0 | 53.918 |
| 1165.0 | 53.826 |
| 1164.0 | 54.047 |
| 1163.0 | 54.574 |
| 1162.0 | 55.386 |
| 1161.0 | 56.388 |
| 1160.0 | 57.547 |
| 1159.0 | 58.702 |
| 1158.0 | 59.729 |
| 1157.0 | 60.445 |
| 1156.0 | 60.878 |
| 1155.0 | 60.993 |
| 1154.0 | 60.826 |
| 1153.0 | 60.501 |
| 1152.0 | 60.111 |
| 1151.0 | 59.772 |
| 1150.0 | 59.608 |
| 1149.0 | 59.655 |
| 1148.0 | 59.929 |
| 1147.0 | 60.382 |
| 1146.0 | 60.976 |
| 1145.0 | 61.54 |
| 1144.0 | 61.979 |
| 1143.0 | 62.216 |
| 1142.0 | 62.183 |
| 1141.0 | 61.91 |
| 1140.0 | 61.44 |
| 1139.0 | 60.901 |
| 1138.0 | 60.38 |
| 1137.0 | 60.011 |
| 1136.0 | 59.84 |
| 1135.0 | 59.968 |
| 1134.0 | 60.326 |
| 1133.0 | 60.828 |
| 1132.0 | 61.4 |
| 1131.0 | 61.921 |
| 1130.0 | 62.25 |
| 1129.0 | 62.158 |
| 1128.0 | 61.583 |
| 1127.0 | 60.59 |
| 1126.0 | 59.24 |
| 1125.0 | 57.734 |
| 1124.0 | 56.227 |
| 1123.0 | 55.052 |
| 1122.0 | 54.226 |
| 1121.0 | 53.847 |
| 1120.0 | 54.059 |
| 1119.0 | 54.779 |
| 1118.0 | 55.946 |
| 1117.0 | 57.384 |
| 1116.0 | 58.852 |
| 1115.0 | 60.045 |
| 1114.0 | 60.717 |
| 1113.0 | 60.733 |
| 1112.0 | 60.077 |
| 1111.0 | 58.952 |
| 1110.0 | 57.603 |
| 1109.0 | 56.335 |
| 1108.0 | 55.305 |
| 1107.0 | 54.735 |
| 1106.0 | 54.661 |
| 1105.0 | 55.095 |
| 1104.0 | 55.943 |
| 1103.0 | 57.049 |
| 1102.0 | 58.181 |
| 1101.0 | 58.997 |
| 1100.0 | 59.302 |
| 1099.0 | 59.054 |
| 1098.0 | 58.22 |
| 1097.0 | 56.947 |
| 1096.0 | 55.496 |
| 1095.0 | 54.157 |
| 1094.0 | 53.033 |
| 1093.0 | 52.347 |
| 1092.0 | 52.221 |
| 1091.0 | 52.644 |
| 1090.0 | 53.668 |
| 1089.0 | 55.122 |
| 1088.0 | 56.946 |
| 1087.0 | 58.674 |
| 1086.0 | 60.335 |
| 1085.0 | 61.565 |
| 1084.0 | 62.233 |
| 1083.0 | 62.34 |
| 1082.0 | 61.926 |
| 1081.0 | 61.317 |
| 1080.0 | 60.652 |
| 1079.0 | 60.162 |
| 1078.0 | 59.923 |
| 1077.0 | 60.016 |
| 1076.0 | 60.384 |
| 1075.0 | 60.925 |
| 1074.0 | 61.526 |
| 1073.0 | 62.145 |
| 1072.0 | 62.669 |
| 1071.0 | 63.053 |
| 1070.0 | 63.375 |
| 1069.0 | 63.65 |
| 1068.0 | 63.944 |
| 1067.0 | 64.265 |
| 1066.0 | 64.546 |
| 1065.0 | 64.702 |
| 1064.0 | 64.692 |
| 1063.0 | 64.388 |
| 1062.0 | 63.77 |
| 1061.0 | 62.946 |
| 1060.0 | 61.901 |
| 1059.0 | 60.963 |
| 1058.0 | 60.212 |
| 1057.0 | 59.805 |
| 1056.0 | 59.778 |
| 1055.0 | 60.13 |
| 1054.0 | 60.762 |
| 1053.0 | 61.401 |
| 1052.0 | 61.861 |
| 1051.0 | 61.772 |
| 1050.0 | 60.909 |
| 1049.0 | 59.491 |
| 1048.0 | 57.538 |
| 1047.0 | 55.52 |
| 1046.0 | 53.644 |
| 1045.0 | 52.36 |
| 1044.0 | 51.84 |
| 1043.0 | 52.145 |
| 1042.0 | 53.281 |
| 1041.0 | 54.9 |
| 1040.0 | 56.703 |
| 1039.0 | 57.836 |
| 1038.0 | 57.764 |
| 1037.0 | 56.084 |
| 1036.0 | 53.274 |
| 1035.0 | 49.84 |
| 1034.0 | 46.249 |
| 1033.0 | 43.44 |
| 1032.0 | 41.498 |
| 1031.0 | 40.79 |
| 1030.0 | 41.342 |
| 1029.0 | 43.228 |
| 1028.0 | 46.217 |
| 1027.0 | 49.999 |
| 1026.0 | 54.108 |
| 1025.0 | 57.155 |
| 1024.0 | 58.266 |
| 1023.0 | 57.389 |
| 1022.0 | 54.771 |
| 1021.0 | 51.485 |
| 1020.0 | 48.188 |
| 1019.0 | 45.739 |
| 1018.0 | 44.64 |
| 1017.0 | 44.767 |
| 1016.0 | 46.234 |
| 1015.0 | 48.823 |
| 1014.0 | 52.443 |
| 1013.0 | 56.301 |
| 1012.0 | 59.385 |
| 1011.0 | 61.254 |
| 1010.0 | 61.417 |
| 1009.0 | 60.062 |
| 1008.0 | 57.736 |
| 1007.0 | 55.555 |
| 1006.0 | 53.916 |
| 1005.0 | 53.336 |
| 1004.0 | 53.958 |
| 1003.0 | 55.787 |
| 1002.0 | 58.477 |
| 1001.0 | 61.585 |
| 1000.0 | 64.287 |
| 999.0 | 66.013 |
| 998.0 | 66.405 |
| 997.0 | 65.581 |
| 996.0 | 64.126 |
| 995.0 | 62.689 |
| 994.0 | 61.67 |
| 993.0 | 61.415 |
| 992.0 | 61.967 |
| 991.0 | 63.156 |
| 990.0 | 64.693 |
| 989.0 | 66.249 |
| 988.0 | 67.379 |
| 987.0 | 68.069 |
| 986.0 | 68.231 |
| 985.0 | 67.938 |
| 984.0 | 67.386 |
| 983.0 | 66.689 |
| 982.0 | 65.863 |
| 981.0 | 64.896 |
| 980.0 | 63.869 |
| 979.0 | 62.785 |
| 978.0 | 61.718 |
| 977.0 | 60.842 |
| 976.0 | 60.359 |
| 975.0 | 60.468 |
| 974.0 | 61.197 |
| 973.0 | 62.39 |
| 972.0 | 63.796 |
| 971.0 | 65.095 |
| 970.0 | 65.755 |
| 969.0 | 65.451 |
| 968.0 | 64.241 |
| 967.0 | 62.335 |
| 966.0 | 60.181 |
| 965.0 | 58.557 |
| 964.0 | 57.677 |
| 963.0 | 57.907 |
| 962.0 | 59.368 |
| 961.0 | 61.806 |
| 960.0 | 64.946 |
| 959.0 | 67.866 |
| 958.0 | 70.045 |
| 957.0 | 71.226 |
| 956.0 | 71.326 |
| 955.0 | 70.778 |
| 954.0 | 70.207 |
| 953.0 | 70.115 |
| 952.0 | 70.741 |
| 951.0 | 71.979 |
| 950.0 | 73.532 |
| 949.0 | 74.814 |
| 948.0 | 75.397 |
| 947.0 | 75.231 |
| 946.0 | 74.57 |
| 945.0 | 73.805 |
| 944.0 | 73.425 |
| 943.0 | 73.674 |
| 942.0 | 74.509 |
| 941.0 | 75.585 |
| 940.0 | 76.487 |
| 939.0 | 76.65 |
| 938.0 | 75.82 |
| 937.0 | 74.204 |
| 936.0 | 72.304 |
| 935.0 | 70.663 |
| 934.0 | 69.829 |
| 933.0 | 69.986 |
| 932.0 | 71.019 |
| 931.0 | 72.538 |
| 930.0 | 74.009 |
| 929.0 | 74.665 |
| 928.0 | 74.136 |
| 927.0 | 72.598 |
| 926.0 | 70.366 |
| 925.0 | 68.173 |
| 924.0 | 66.805 |
| 923.0 | 66.554 |
| 922.0 | 67.459 |
| 921.0 | 69.181 |
| 920.0 | 71.352 |
| 919.0 | 73.228 |
| 918.0 | 74.389 |
| 917.0 | 74.876 |
| 916.0 | 74.968 |
| 915.0 | 75.1 |
| 914.0 | 75.646 |
| 913.0 | 76.765 |
| 912.0 | 78.214 |
| 911.0 | 79.589 |
| 910.0 | 80.511 |
| 909.0 | 80.806 |
| 908.0 | 80.535 |
| 907.0 | 80.048 |
| 906.0 | 79.735 |
| 905.0 | 79.864 |
| 904.0 | 80.447 |
| 903.0 | 81.273 |
| 902.0 | 82.093 |
| 901.0 | 82.628 |
| 900.0 | 82.787 |
| 899.0 | 82.714 |
| 898.0 | 82.593 |
| 897.0 | 82.59 |
| 896.0 | 82.745 |
| 895.0 | 82.956 |
| 894.0 | 83.025 |
| 893.0 | 82.791 |
| 892.0 | 82.201 |
| 891.0 | 81.35 |
| 890.0 | 80.379 |
| 889.0 | 79.415 |
| 888.0 | 78.519 |
| 887.0 | 77.618 |
| 886.0 | 76.555 |
| 885.0 | 75.237 |
| 884.0 | 73.735 |
| 883.0 | 72.34 |
| 882.0 | 71.351 |
| 881.0 | 70.913 |
| 880.0 | 71.008 |
| 879.0 | 71.324 |
| 878.0 | 71.366 |
| 877.0 | 70.753 |
| 876.0 | 69.35 |
| 875.0 | 67.347 |
| 874.0 | 65.315 |
| 873.0 | 63.98 |
| 872.0 | 63.77 |
| 871.0 | 64.798 |
| 870.0 | 66.653 |
| 869.0 | 68.563 |
| 868.0 | 69.87 |
| 867.0 | 70.196 |
| 866.0 | 69.624 |
| 865.0 | 68.457 |
| 864.0 | 67.368 |
| 863.0 | 67.037 |
| 862.0 | 67.699 |
| 861.0 | 69.406 |
| 860.0 | 72.764 |
| 859.0 | 79.321 |
| 858.0 | 85.981 |
| 857.0 | 88.243 |
| 856.0 | 86.616 |
| 855.0 | 83.931 |
| 854.0 | 82.673 |
| 853.0 | 83.574 |
| 852.0 | 85.879 |
| 851.0 | 87.561 |
| 850.0 | 86.866 |
| 849.0 | 83.675 |
| 848.0 | 79.591 |
| 847.0 | 76.795 |
| 846.0 | 76.712 |
| 845.0 | 79.348 |
| 844.0 | 83.009 |
| 843.0 | 84.85 |
| 842.0 | 82.785 |
| 841.0 | 76.954 |
| 840.0 | 69.422 |
| 839.0 | 62.86 |
| 838.0 | 58.806 |
| 837.0 | 57.537 |
| 836.0 | 58.745 |
| 835.0 | 61.511 |
| 834.0 | 64.76 |
| 833.0 | 67.46 |
| 832.0 | 68.997 |
| 831.0 | 69.452 |
| 830.0 | 69.123 |
| 829.0 | 68.411 |
| 828.0 | 67.715 |
| 827.0 | 67.338 |
| 826.0 | 67.812 |
| 825.0 | 69.754 |
| 824.0 | 73.421 |
| 823.0 | 78.438 |
| 822.0 | 83.725 |
| 821.0 | 87.594 |
| 820.0 | 88.945 |
| 819.0 | 88.323 |
| 818.0 | 87.555 |
| 817.0 | 88.326 |
| 816.0 | 90.903 |
| 815.0 | 93.376 |
| 814.0 | 92.708 |
| 813.0 | 87.856 |
| 812.0 | 80.448 |
| 811.0 | 73.485 |
| 810.0 | 69.339 |
| 809.0 | 68.658 |
| 808.0 | 70.24 |
| 807.0 | 71.423 |
| 806.0 | 69.761 |
| 805.0 | 65.207 |
| 804.0 | 60.37 |
| 803.0 | 57.729 |
| 802.0 | 58.347 |
| 801.0 | 61.426 |
| 800.0 | 63.85 |
| 799.0 | 61.836 |
| 798.0 | 54.917 |
| 797.0 | 46.448 |
| 796.0 | 40.321 |
| 795.0 | 38.375 |
| 794.0 | 41.047 |
| 793.0 | 48.01 |
| 792.0 | 56.881 |
| 791.0 | 62.126 |
| 790.0 | 59.65 |
| 789.0 | 51.701 |
| 788.0 | 44.125 |
| 787.0 | 40.544 |
| 786.0 | 41.94 |
| 785.0 | 48.296 |
| 784.0 | 58.113 |
| 783.0 | 67.928 |
| 782.0 | 73.317 |
| 781.0 | 72.785 |
| 780.0 | 69.127 |
| 779.0 | 66.203 |
| 778.0 | 66.187 |
| 777.0 | 69.553 |
| 776.0 | 75.584 |
| 775.0 | 82.778 |
| 774.0 | 89.037 |
| 773.0 | 92.132 |
| 772.0 | 91.069 |
| 771.0 | 87.186 |
| 770.0 | 83.273 |
| 769.0 | 82.196 |
| 768.0 | 85.141 |
| 767.0 | 89.891 |
| 766.0 | 91.196 |
| 765.0 | 85.906 |
| 764.0 | 76.507 |
| 763.0 | 68.377 |
| 762.0 | 65.298 |
| 761.0 | 67.894 |
| 760.0 | 73.872 |
| 759.0 | 77.587 |
| 758.0 | 74.45 |
| 757.0 | 66.253 |
| 756.0 | 59.329 |
| 755.0 | 57.882 |
| 754.0 | 62.954 |
| 753.0 | 72.606 |
| 752.0 | 81.184 |
| 751.0 | 83.298 |
| 750.0 | 79.595 |
| 749.0 | 76.034 |
| 748.0 | 77.684 |
| 747.0 | 84.737 |
| 746.0 | 91.306 |
| 745.0 | 91.367 |
| 744.0 | 85.889 |
| 743.0 | 81.005 |
| 742.0 | 81.4 |
| 741.0 | 86.71 |
| 740.0 | 91.11 |
| 739.0 | 88.254 |
| 738.0 | 79.092 |
| 737.0 | 70.437 |
| 736.0 | 67.358 |
| 735.0 | 70.121 |
| 734.0 | 74.652 |
| 733.0 | 75.549 |
| 732.0 | 70.995 |
| 731.0 | 63.883 |
| 730.0 | 58.197 |
| 729.0 | 55.89 |
| 728.0 | 56.543 |
| 727.0 | 58.797 |
| 726.0 | 61.46 |
| 725.0 | 63.495 |
| 724.0 | 63.854 |
| 723.0 | 62.188 |
| 722.0 | 59.324 |
| 721.0 | 57.62 |
| 720.0 | 59.915 |
| 719.0 | 67.93 |
| 718.0 | 78.63 |
| 717.0 | 83.95 |
| 716.0 | 79.329 |
| 715.0 | 70.823 |
| 714.0 | 67.611 |
| 713.0 | 73.239 |
| 712.0 | 84.36 |
| 711.0 | 91.232 |
| 710.0 | 87.421 |
| 709.0 | 78.68 |
| 708.0 | 75.893 |
| 707.0 | 81.462 |
| 706.0 | 86.096 |
| 705.0 | 79.261 |
| 704.0 | 64.399 |
| 703.0 | 52.509 |
| 702.0 | 48.627 |
| 701.0 | 51.255 |
| 700.0 | 54.974 |
| 699.0 | 53.764 |
| 698.0 | 47.55 |
| 697.0 | 41.9 |
| 696.0 | 40.756 |
| 695.0 | 43.592 |
| 694.0 | 46.822 |
| 693.0 | 47.175 |
| 692.0 | 44.891 |
| 691.0 | 42.933 |
| 690.0 | 43.554 |
| 689.0 | 46.303 |
| 688.0 | 48.676 |
| 687.0 | 49.536 |
| 686.0 | 49.798 |
| 685.0 | 51.419 |
| 684.0 | 54.66 |
| 683.0 | 58.012 |
| 682.0 | 60.331 |
| 681.0 | 62.465 |
| 680.0 | 66.163 |
| 679.0 | 71.867 |
| 678.0 | 77.974 |
| 677.0 | 82.243 |
| 676.0 | 84.455 |
| 675.0 | 86.673 |
| 674.0 | 89.905 |
| 673.0 | 93.711 |
| 672.0 | 96.478 |
| 671.0 | 95.874 |
| 670.0 | 90.878 |
| 669.0 | 83.602 |
| 668.0 | 78.671 |
| 667.0 | 79.898 |
| 666.0 | 86.829 |
| 665.0 | 93.538 |
| 664.0 | 93.034 |
| 663.0 | 87.165 |
| 662.0 | 83.228 |
| 661.0 | 85.776 |
| 660.0 | 92.421 |
| 659.0 | 95.605 |
| 658.0 | 92.271 |
| 657.0 | 88.187 |
| 656.0 | 88.921 |
| 655.0 | 93.568 |
| 654.0 | 96.593 |
| 653.0 | 95.318 |
| 652.0 | 92.709 |
| 651.0 | 92.663 |
| 650.0 | 94.646 |
| 649.0 | 95.291 |
| 648.0 | 92.552 |
| 647.0 | 88.553 |
| 646.0 | 87.013 |
| 645.0 | 89.37 |
| 644.0 | 92.849 |
| 643.0 | 93.45 |
| 642.0 | 90.171 |
| 641.0 | 86.363 |
| 640.0 | 86.543 |
| 639.0 | 91.46 |
| 638.0 | 95.323 |
| 637.0 | 93.497 |
| 636.0 | 89.252 |
| 635.0 | 88.964 |
| 634.0 | 92.997 |
| 633.0 | 96.008 |
| 632.0 | 94.854 |
| 631.0 | 93.327 |
| 630.0 | 94.815 |
| 629.0 | 95.591 |
| 628.0 | 90.876 |
| 627.0 | 84.952 |
| 626.0 | 85.168 |
| 625.0 | 90.841 |
| 624.0 | 92.716 |
| 623.0 | 86.823 |
| 622.0 | 80.674 |
| 621.0 | 82.079 |
| 620.0 | 88.924 |
| 619.0 | 91.913 |
| 618.0 | 88.02 |
| 617.0 | 84.288 |
| 616.0 | 86.775 |
| 615.0 | 92.821 |
| 614.0 | 96.23 |
| 613.0 | 95.924 |
| 612.0 | 95.466 |
| 611.0 | 96.588 |
| 610.0 | 97.531 |
| 609.0 | 96.198 |
| 608.0 | 93.012 |
| 607.0 | 90.969 |
| 606.0 | 92.342 |
| 605.0 | 95.497 |
| 604.0 | 97.022 |
| 603.0 | 95.923 |
| 602.0 | 94.683 |
| 601.0 | 95.553 |
| 600.0 | 97.462 |
| 599.0 | 97.718 |
| 598.0 | 96.811 |
| 597.0 | 96.986 |
| 596.0 | 98.137 |
| 595.0 | 98.786 |
| 594.0 | 98.706 |
| 593.0 | 98.651 |
| 592.0 | 99.026 |
| 591.0 | 99.425 |
| 590.0 | 99.434 |
| 589.0 | 99.389 |
| 588.0 | 99.434 |
| 587.0 | 99.434 |
| 586.0 | 99.423 |
| 585.0 | 99.557 |
| 584.0 | 99.493 |
| 583.0 | 99.411 |
| 582.0 | 99.47 |
| 581.0 | 99.473 |
| 580.0 | 99.461 |
| 579.0 | 99.547 |
| 578.0 | 99.513 |
| 577.0 | 99.402 |
| 576.0 | 99.451 |
| 575.0 | 99.536 |
| 574.0 | 99.514 |
| 573.0 | 99.514 |
| 572.0 | 99.483 |
| 571.0 | 99.499 |
| 570.0 | 97.815 |
| 569.0 | 97.631 |
| 568.0 | 97.899 |
| 567.0 | 97.955 |
| 566.0 | 98.605 |
| 565.0 | 97.371 |
| 564.0 | 97.724 |
| 563.0 | 99.069 |
| 562.0 | 97.464 |
| 561.0 | 97.82 |
| 560.0 | 97.779 |
| 559.0 | 97.798 |
| 558.0 | 98.145 |
| 557.0 | 97.838 |
| 556.0 | 97.745 |
| 555.0 | 97.473 |
| 554.0 | 98.063 |
| 553.0 | 97.706 |
| 552.0 | 98.134 |
| 551.0 | 98.236 |
| 550.0 | 98.159 |
| 549.0 | 98.355 |
| 548.0 | 98.023 |
| 547.0 | 98.334 |
| 546.0 | 99.086 |
| 545.0 | 98.639 |
| 544.0 | 98.315 |
| 543.0 | 97.711 |
| 542.0 | 99.074 |
| 541.0 | 97.452 |
| 540.0 | 97.825 |
| 539.0 | 97.767 |
| 538.0 | 97.803 |
| 537.0 | 98.133 |
| 536.0 | 97.843 |
| 535.0 | 97.733 |
| 534.0 | 97.478 |
| 533.0 | 98.051 |
| 532.0 | 97.711 |
| 531.0 | 98.121 |
| 530.0 | 97.741 |
| 529.0 | 97.646 |
| 528.0 | 97.86 |
| 527.0 | 97.511 |
| 526.0 | 98.339 |
| 525.0 | 98.543 |
| 524.0 | 98.644 |
| 523.0 | 98.302 |
| 522.0 | 98.339 |
| 521.0 | 99.074 |
| 520.0 | 98.644 |
| 519.0 | 98.302 |
| 518.0 | 97.82 |
| 517.0 | 97.668 |
| 516.0 | 97.946 |
| 515.0 | 97.96 |
| 514.0 | 98.642 |
| 513.0 | 97.419 |
| 512.0 | 97.729 |
| 511.0 | 99.106 |
| 510.0 | 97.512 |
| 509.0 | 98.825 |
| 508.0 | 98.817 |
| 507.0 | 97.845 |
| 506.0 | 98.15 |
| 505.0 | 97.876 |
| 504.0 | 97.792 |
| 503.0 | 97.477 |
| 502.0 | 98.101 |
| 501.0 | 97.754 |
| 500.0 | 98.138 |
| 499.0 | 97.773 |
| 498.0 | 97.706 |
| 497.0 | 97.86 |
| 496.0 | 97.56 |
| 495.0 | 97.482 |
| 494.0 | 97.81 |
| 493.0 | 97.776 |
| 492.0 | 97.462 |
| 491.0 | 97.816 |
| 490.0 | 98.211 |
| 489.0 | 97.6 |
| 488.0 | 97.93 |
| 487.0 | 97.905 |
| 486.0 | 97.95 |
| 485.0 | 97.237 |
| 484.0 | 97.881 |
| 483.0 | 97.78 |
| 482.0 | 97.482 |
| 481.0 | 98.088 |
| 480.0 | 97.759 |
| 479.0 | 98.126 |
| 478.0 | 97.778 |
| 477.0 | 97.694 |
| 476.0 | 97.865 |
| 475.0 | 97.548 |
| 474.0 | 98.387 |
| 473.0 | 98.56 |
| 472.0 | 98.681 |
| 471.0 | 98.35 |
| 470.0 | 98.344 |
| 469.0 | 99.111 |
| 468.0 | 98.691 |
| 467.0 | 98.307 |
| 466.0 | 98.175 |
| 465.0 | 97.928 |
| 464.0 | 97.785 |
| 463.0 | 97.52 |
| 462.0 | 98.136 |
| 461.0 | 97.764 |
| 460.0 | 98.164 |
| 459.0 | 97.826 |
| 458.0 | 97.699 |
| 457.0 | 97.902 |
| 456.0 | 97.596 |
| 455.0 | 97.992 |
| 454.0 | 97.716 |
| 453.0 | 97.329 |
| 452.0 | 97.955 |
| 451.0 | 97.981 |
| 450.0 | 98.759 |
| 449.0 | 98.296 |
| 448.0 | 97.945 |
| 447.0 | 97.902 |
| 446.0 | 97.822 |
| 445.0 | 97.933 |
| 444.0 | 97.822 |
| 443.0 | 97.567 |
| 442.0 | 98.141 |
| 441.0 | 97.801 |
| 440.0 | 98.211 |
| 439.0 | 98.33 |
| 438.0 | 98.236 |
| 437.0 | 98.449 |
| 436.0 | 98.1 |
| 435.0 | 98.429 |
| 434.0 | 99.164 |
| 433.0 | 98.734 |
| 432.0 | 98.392 |
| 431.0 | 98.429 |
| 430.0 | 99.164 |
| 429.0 | 98.734 |
| 428.0 | 98.392 |
| 427.0 | 98.137 |
| 426.0 | 98.381 |
| 425.0 | 98.28 |
| 424.0 | 97.982 |
| 423.0 | 97.802 |
| 422.0 | 97.759 |
| 421.0 | 97.736 |
| 420.0 | 97.949 |
| 419.0 | 97.6 |
| 418.0 | 98.429 |
| 417.0 | 98.305 |
| 416.0 | 98.35 |
| 415.0 | 99.574 |
| 414.0 | 97.952 |
| 413.0 | 98.325 |
| 412.0 | 98.267 |
| 411.0 | 89.859 |
| 410.0 | 17.67 |
| 409.0 | 0.241 |
| 408.0 | 0.018 |
| 407.0 | 0.001 |
| 406.0 | 0 |
| 405.0 | 0 |
| 404.0 | 0 |
| 403.0 | 0 |
| 402.0 | 0.001 |
| 401.0 | 0.025 |
| 400.0 | 0.179 |
| 399.0 | 22.507 |
| 398.0 | 91.45 |
| 397.0 | 98.051 |
| 396.0 | 98.38 |
| 395.0 | 98.283 |
| 394.0 | 98.305 |
| 393.0 | 97.646 |
| 392.0 | 97.86 |
| 391.0 | 97.511 |
| 390.0 | 98.042 |
| 389.0 | 97.416 |
| 388.0 | 97.825 |
| 387.0 | 97.767 |
| 386.0 | 97.803 |
| 385.0 | 97.636 |
| 384.0 | 97.887 |
| 383.0 | 97.96 |
| 382.0 | 98.593 |
| 381.0 | 97.376 |
| 380.0 | 97.711 |
| 379.0 | 99.074 |
| 378.0 | 97.452 |
| 377.0 | 97.825 |
| 376.0 | 97.767 |
| 375.0 | 97.803 |
| 374.0 | 98.133 |
| 373.0 | 97.843 |
| 372.0 | 97.733 |
| 371.0 | 97.478 |
| 370.0 | 98.051 |
| 369.0 | 97.711 |
| 368.0 | 98.121 |
| 367.0 | 97.741 |
| 366.0 | 97.646 |
| 365.0 | 97.86 |
| 364.0 | 97.511 |
| 363.0 | 98.339 |
| 362.0 | 99.074 |
| 361.0 | 98.644 |
| 360.0 | 98.302 |
| 359.0 | 97.662 |
| 358.0 | 97.68 |
| 357.0 | 97.415 |
| 356.0 | 96.473 |
| 355.0 | 94.78 |
| 354.0 | 91.907 |
| 353.0 | 87.507 |
| 352.0 | 81.676 |
| 351.0 | 74.979 |
| 350.0 | 68.56 |
| 349.0 | 65.752 |
| 348.0 | 67.962 |
| 347.0 | 71.723 |
| 346.0 | 73.288 |
| 345.0 | 72.685 |
| 344.0 | 72.44 |
| 343.0 | 72.423 |
| 342.0 | 70.307 |
| 341.0 | 66.612 |
| 340.0 | 63.122 |
| 339.0 | 59.442 |
| 338.0 | 54.21 |
| 337.0 | 48.97 |
| 336.0 | 46.063 |
| 335.0 | 44.589 |
| 334.0 | 42.167 |
| 333.0 | 37.76 |
| 332.0 | 33.075 |
| 331.0 | 30.259 |
| 330.0 | 28.816 |
| 329.0 | 27.426 |
| 328.0 | 25.281 |
| 327.0 | 22.58 |
| 326.0 | 19.922 |
| 325.0 | 17.815 |
| 324.0 | 16.534 |
| 323.0 | 15.377 |
| 322.0 | 14.161 |
| 321.0 | 13.592 |
| 320.0 | 14.766 |
| 319.0 | 16.956 |
| 318.0 | 17.993 |
| 317.0 | 17.231 |
| 316.0 | 15.596 |
| 315.0 | 14.201 |
| 314.0 | 13.305 |
| 313.0 | 11.894 |
| 312.0 | 10.042 |
| 311.0 | 8.939 |
| 310.0 | 7.867 |
| 309.0 | 5.521 |
| 308.0 | 2.887 |
| 307.0 | 1.328 |
| 306.0 | 0.657 |
| 305.0 | 0.273 |
| 304.0 | 0.058 |
| 303.0 | 0.006 |
| 302.0 | 0.003 |
| 301.0 | 0.003 |
| 300.0 | 0.002 |
| 299.0 | 0.004 |
| 298.0 | 0.007 |
| 297.0 | 0 |
| 296.0 | 0.004 |
| 295.0 | 0 |
| 294.0 | 0.001 |
| 293.0 | 0.004 |
| 292.0 | 0.005 |
| 291.0 | 0.003 |
| 290.0 | 0.004 |
| 289.0 | 0 |
| 288.0 | 0.003 |
| 287.0 | 0.004 |
| 286.0 | 0.007 |
| 285.0 | 0.001 |
| 284.0 | 0.005 |
| 283.0 | 0 |
| 282.0 | 0.001 |
| 281.0 | 0.004 |
| 280.0 | 0.007 |
| 279.0 | 0.002 |
| 278.0 | 0.007 |
| 277.0 | 0 |
| 276.0 | 0.002 |
| 275.0 | 0.004 |
| 274.0 | 0.007 |
| 273.0 | 0 |
| 272.0 | 0.005 |
| 271.0 | 0 |
| 270.0 | 0.001 |
| 269.0 | 0.005 |
| 268.0 | 0.007 |
| 267.0 | 0.001 |
| 266.0 | 0.002 |
| 265.0 | 0.002 |
| 264.0 | 0.001 |
| 263.0 | 0.005 |
| 262.0 | 0.007 |
| 261.0 | 0.002 |
| 260.0 | 0.006 |
| 259.0 | 0.001 |
| 258.0 | 0.001 |
| 257.0 | 0.006 |
| 256.0 | 0.005 |
| 255.0 | 0.005 |
| 254.0 | 0.005 |
| 253.0 | 0.002 |
| 252.0 | 0.002 |
| 251.0 | 0.006 |
| 250.0 | 0.005 |
| 249.0 | 0.003 |
| 248.0 | 0.006 |
| 247.0 | 0.001 |
| 246.0 | 0 |
| 245.0 | 0.006 |
| 244.0 | 0.005 |
| 243.0 | 0.003 |
| 242.0 | 0.005 |
| 241.0 | 0.002 |
| 240.0 | 0.001 |
| 239.0 | 0.006 |
| 238.0 | 0.005 |
| 237.0 | 0.005 |
| 236.0 | 0.005 |
| 235.0 | 0.002 |
| 234.0 | 0.001 |
| 233.0 | 0.006 |
| 232.0 | 0.006 |
| 231.0 | 0.004 |
| 230.0 | 0.006 |
| 229.0 | 0.002 |
| 228.0 | 0.002 |
| 227.0 | 0.007 |
| 226.0 | 0.005 |
| 225.0 | 0.003 |
| 224.0 | 0.006 |
| 223.0 | 0.002 |
| 222.0 | 0.002 |
| 221.0 | 0.006 |
| 220.0 | 0.007 |
| 219.0 | 0.002 |
| 218.0 | 0.006 |
| 217.0 | 0.001 |
| 216.0 | 0.003 |
| 215.0 | 0.005 |
| 214.0 | 0.006 |
| 213.0 | 0.005 |
| 212.0 | 0.006 |
| 211.0 | 0.001 |
| 210.0 | 0.003 |
| 209.0 | 0.006 |
| 208.0 | 0.008 |
| 207.0 | 0.003 |
| 206.0 | 0.007 |
| 205.0 | 0.003 |
| 204.0 | 0.004 |
| 203.0 | 0.007 |
| 202.0 | 0.009 |
| 201.0 | 0.008 |